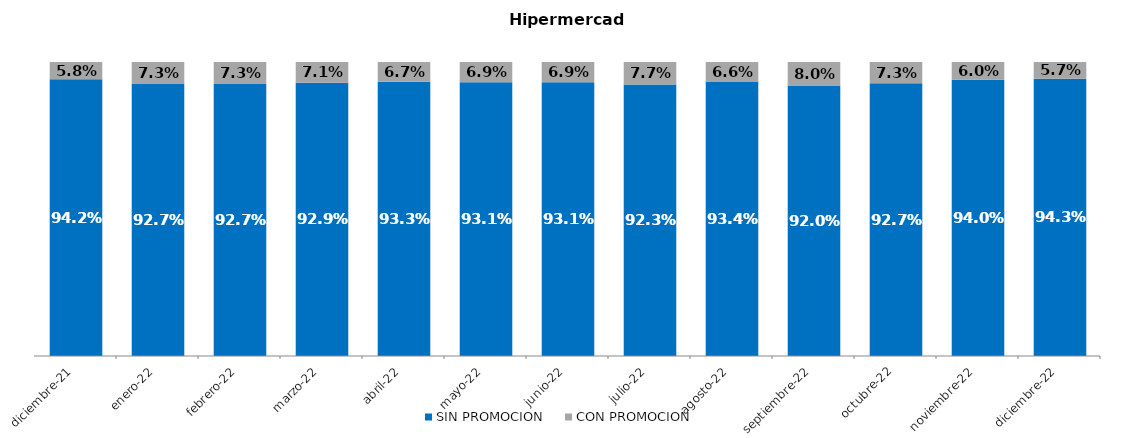
| Category | SIN PROMOCION   | CON PROMOCION   |
|---|---|---|
| 2021-12-01 | 0.942 | 0.058 |
| 2022-01-01 | 0.927 | 0.073 |
| 2022-02-01 | 0.927 | 0.073 |
| 2022-03-01 | 0.929 | 0.071 |
| 2022-04-01 | 0.933 | 0.067 |
| 2022-05-01 | 0.931 | 0.069 |
| 2022-06-01 | 0.931 | 0.069 |
| 2022-07-01 | 0.923 | 0.077 |
| 2022-08-01 | 0.934 | 0.066 |
| 2022-09-01 | 0.92 | 0.08 |
| 2022-10-01 | 0.927 | 0.073 |
| 2022-11-01 | 0.94 | 0.06 |
| 2022-12-01 | 0.943 | 0.057 |